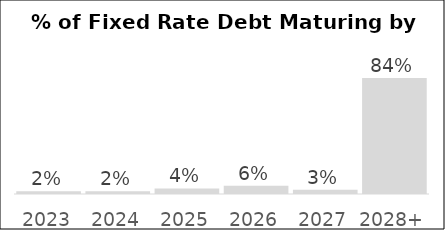
| Category | Series 0 |
|---|---|
| 2023 | 0.02 |
| 2024 | 0.02 |
| 2025 | 0.04 |
| 2026 | 0.06 |
| 2027 | 0.03 |
| 2028+ | 0.84 |